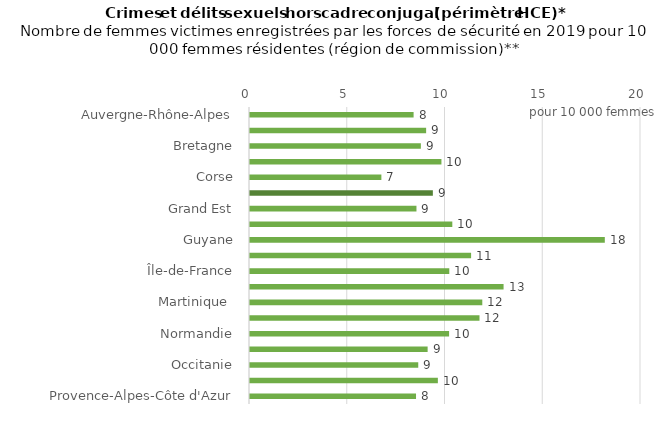
| Category | Series 0 |
|---|---|
| Auvergne-Rhône-Alpes | 8.368 |
| Bourgogne-Franche-Comté | 9.009 |
| Bretagne | 8.739 |
| Centre-Val de Loire | 9.792 |
| Corse | 6.72 |
| France métropolitaine | 9.354 |
| Grand Est | 8.515 |
| Guadeloupe  | 10.349 |
| Guyane | 18.149 |
| Hauts-de-France | 11.309 |
| Île-de-France | 10.193 |
| La Réunion | 12.971 |
| Martinique  | 11.882 |
| Mayotte | 11.739 |
| Normandie | 10.184 |
| Nouvelle-Aquitaine | 9.086 |
| Occitanie | 8.606 |
| Pays de la Loire | 9.61 |
| Provence-Alpes-Côte d'Azur | 8.492 |